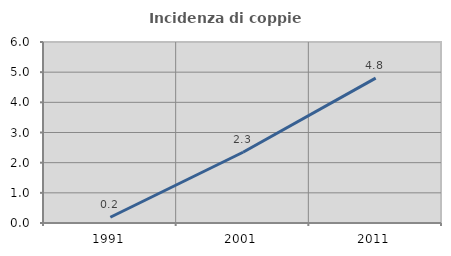
| Category | Incidenza di coppie miste |
|---|---|
| 1991.0 | 0.19 |
| 2001.0 | 2.345 |
| 2011.0 | 4.801 |